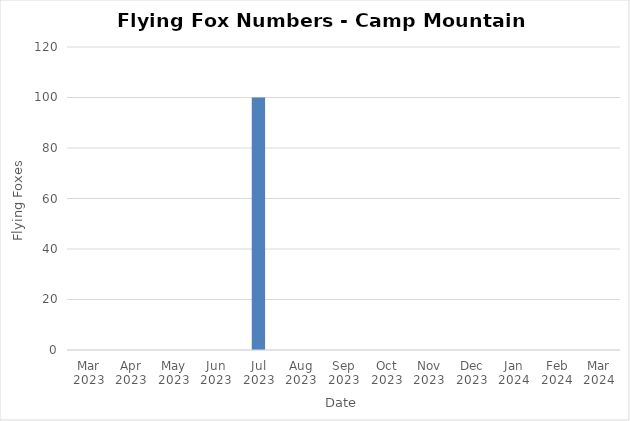
| Category | Series 0 |
|---|---|
| Mar 2023 | 0 |
| Apr 2023 | 0 |
| May 2023 | 0 |
| Jun 2023 | 0 |
| Jul 2023 | 100 |
| Aug 2023 | 0 |
| Sep 2023 | 0 |
| Oct 2023 | 0 |
| Nov 2023 | 0 |
| Dec 2023 | 0 |
| Jan 2024 | 0 |
| Feb 2024 | 0 |
| Mar 2024 | 0 |